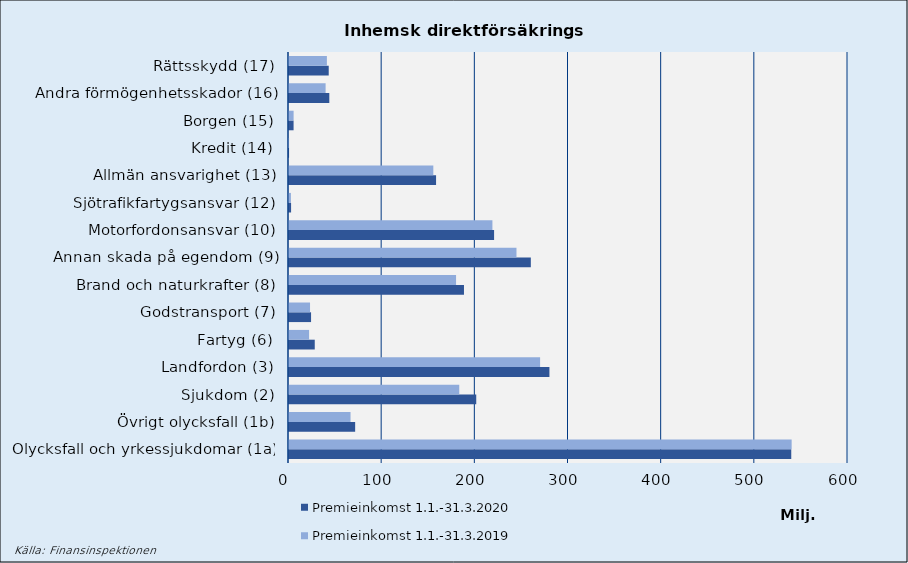
| Category | Premieinkomst |
|---|---|
| Olycksfall och yrkessjukdomar (1a) | 539513.537 |
| Övrigt olycksfall (1b) | 66050.603 |
| Sjukdom (2) | 182750.453 |
| Landfordon (3) | 269526.724 |
| Fartyg (6) | 21557.844 |
| Godstransport (7) | 22576.198 |
| Brand och naturkrafter (8) | 179312.245 |
| Annan skada på egendom (9) | 244162.116 |
| Motorfordonsansvar (10) | 218331.846 |
| Sjötrafikfartygsansvar (12) | 2032.137 |
| Allmän ansvarighet (13) | 154905.83 |
| Kredit (14) | 74.073 |
| Borgen (15) | 4938.693 |
| Andra förmögenhetsskador (16) | 39294.524 |
| Rättsskydd (17) | 40669.128 |